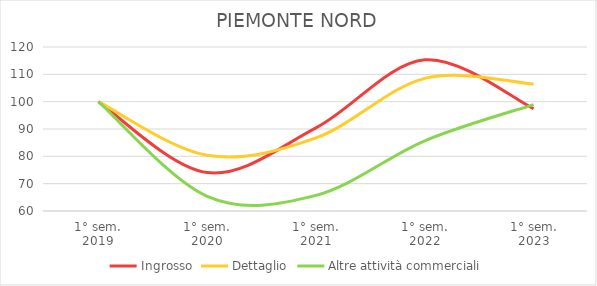
| Category | Ingrosso | Dettaglio | Altre attività commerciali |
|---|---|---|---|
| 1° sem.
2019 | 100 | 100 | 100 |
| 1° sem.
2020 | 74.05 | 80.375 | 65.371 |
| 1° sem.
2021 | 90.415 | 86.737 | 65.724 |
| 1° sem.
2022 | 115.313 | 108.52 | 85.689 |
| 1° sem.
2023 | 97.428 | 106.419 | 98.94 |